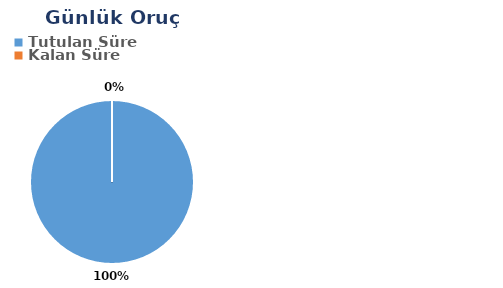
| Category | Günlük |
|---|---|
| Tutulan Süre | 0.584 |
| Kalan Süre | 0 |